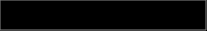
| Category | Series 0 |
|---|---|
| 0 | 0.027 |
| 1 | 0.958 |
| 2 | 0.015 |